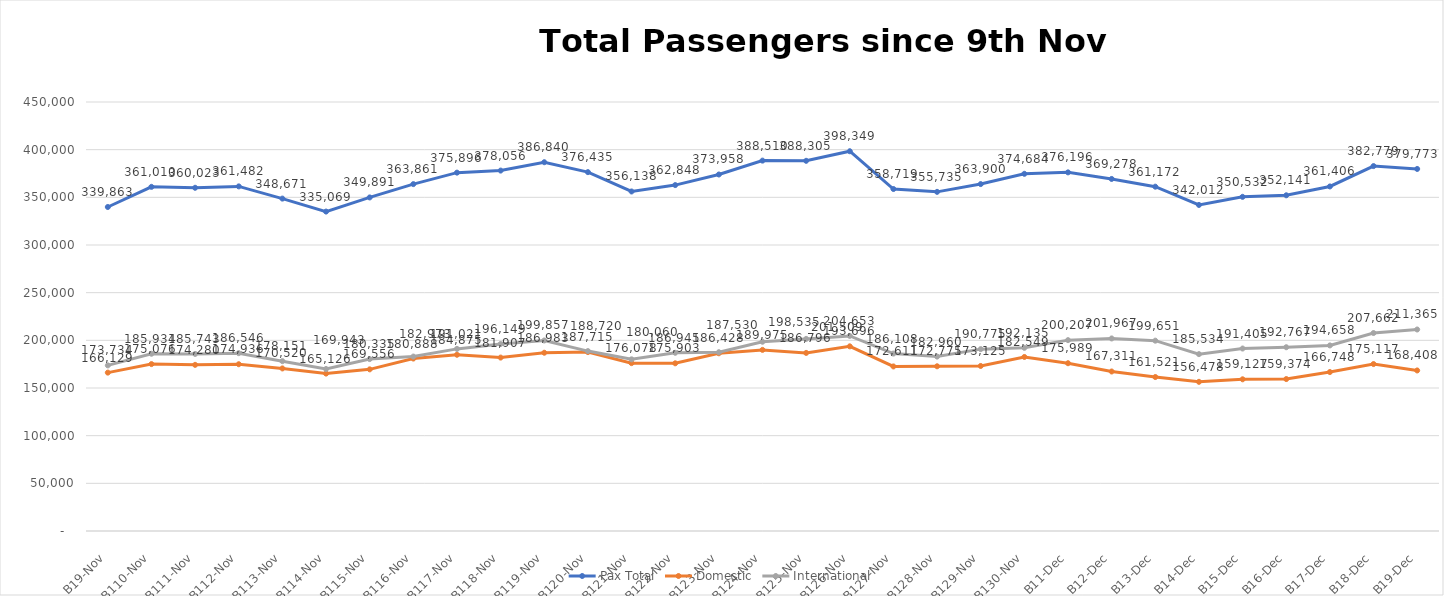
| Category | Pax Total | Domestic | International |
|---|---|---|---|
| 2023-11-09 | 339863 | 166129 | 173734 |
| 2023-11-10 | 361010 | 175076 | 185934 |
| 2023-11-11 | 360023 | 174280 | 185743 |
| 2023-11-12 | 361482 | 174936 | 186546 |
| 2023-11-13 | 348671 | 170520 | 178151 |
| 2023-11-14 | 335069 | 165126 | 169943 |
| 2023-11-15 | 349891 | 169556 | 180335 |
| 2023-11-16 | 363861 | 180888 | 182973 |
| 2023-11-17 | 375896 | 184875 | 191021 |
| 2023-11-18 | 378056 | 181907 | 196149 |
| 2023-11-19 | 386840 | 186983 | 199857 |
| 2023-11-20 | 376435 | 187715 | 188720 |
| 2023-11-21 | 356138 | 176078 | 180060 |
| 2023-11-22 | 362848 | 175903 | 186945 |
| 2023-11-23 | 373958 | 186428 | 187530 |
| 2023-11-24 | 388510 | 189975 | 198535 |
| 2023-11-25 | 388305 | 186796 | 201509 |
| 2023-11-26 | 398349 | 193696 | 204653 |
| 2023-11-27 | 358719 | 172611 | 186108 |
| 2023-11-28 | 355735 | 172775 | 182960 |
| 2023-11-29 | 363900 | 173125 | 190775 |
| 2023-11-30 | 374684 | 182549 | 192135 |
| 2023-12-01 | 376196 | 175989 | 200207 |
| 2023-12-02 | 369278 | 167311 | 201967 |
| 2023-12-03 | 361172 | 161521 | 199651 |
| 2023-12-04 | 342012 | 156478 | 185534 |
| 2023-12-05 | 350532 | 159127 | 191405 |
| 2023-12-06 | 352141 | 159374 | 192767 |
| 2023-12-07 | 361406 | 166748 | 194658 |
| 2023-12-08 | 382779 | 175117 | 207662 |
| 2023-12-09 | 379773 | 168408 | 211365 |